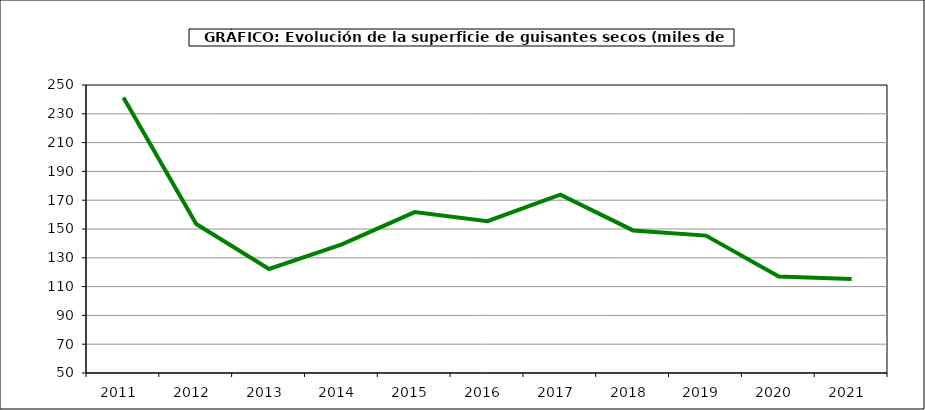
| Category | Superficie |
|---|---|
| 2011.0 | 241.347 |
| 2012.0 | 153.482 |
| 2013.0 | 122.246 |
| 2014.0 | 139.386 |
| 2015.0 | 161.746 |
| 2016.0 | 155.409 |
| 2017.0 | 173.854 |
| 2018.0 | 149.02 |
| 2019.0 | 145.399 |
| 2020.0 | 116.993 |
| 2021.0 | 115.333 |